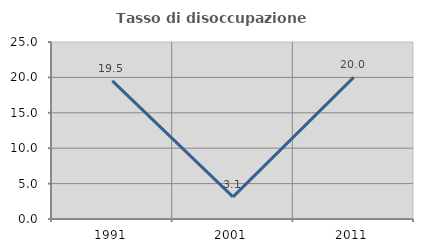
| Category | Tasso di disoccupazione giovanile  |
|---|---|
| 1991.0 | 19.512 |
| 2001.0 | 3.125 |
| 2011.0 | 20 |